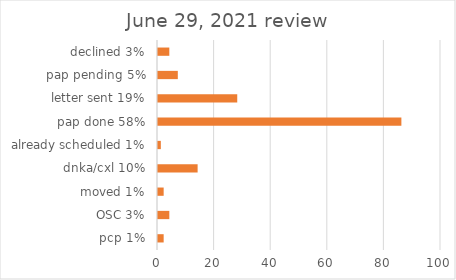
| Category | Series 1 |
|---|---|
| pcp 1% | 2 |
| OSC 3% | 4 |
| moved 1% | 2 |
| dnka/cxl 10% | 14 |
| already scheduled 1% | 1 |
| pap done 58% | 86 |
| letter sent 19% | 28 |
| pap pending 5% | 7 |
| declined 3% | 4 |